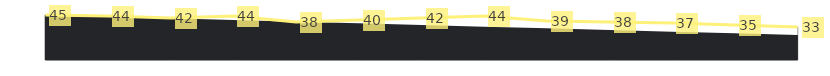
| Category | 5km laufen - Summe von Ist |
|---|---|
| 0 | 45 |
| 1 | 44 |
| 2 | 42 |
| 3 | 44 |
| 4 | 38 |
| 5 | 40 |
| 6 | 42 |
| 7 | 44 |
| 8 | 39 |
| 9 | 38 |
| 10 | 37 |
| 11 | 35 |
| 12 | 33 |